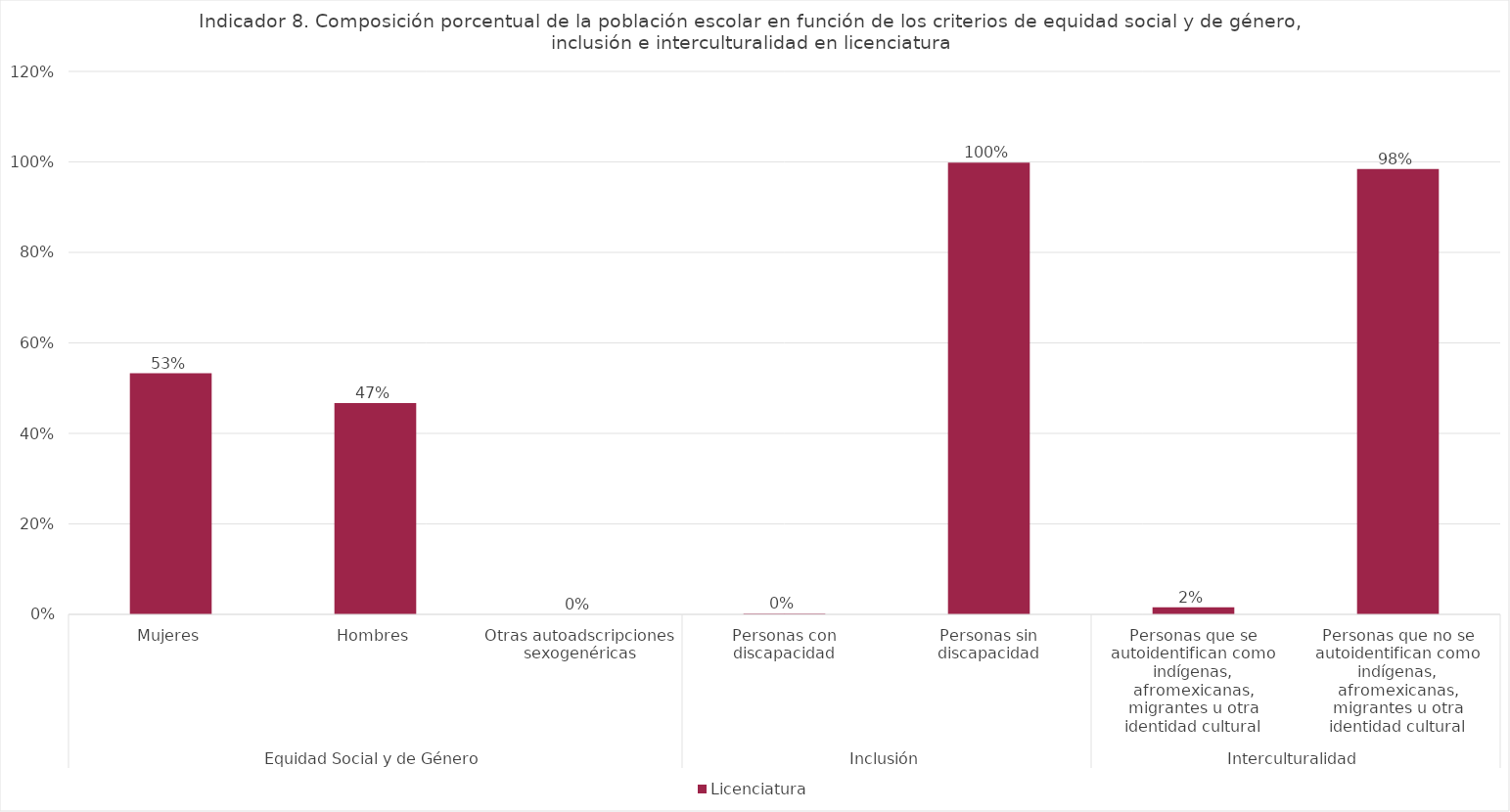
| Category | Licenciatura |
|---|---|
| 0 | 0.533 |
| 1 | 0.467 |
| 2 | 0 |
| 3 | 0.002 |
| 4 | 0.998 |
| 5 | 0.015 |
| 6 | 0.985 |